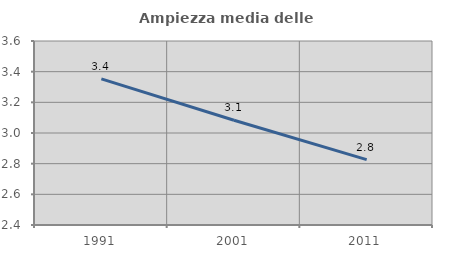
| Category | Ampiezza media delle famiglie |
|---|---|
| 1991.0 | 3.353 |
| 2001.0 | 3.083 |
| 2011.0 | 2.827 |